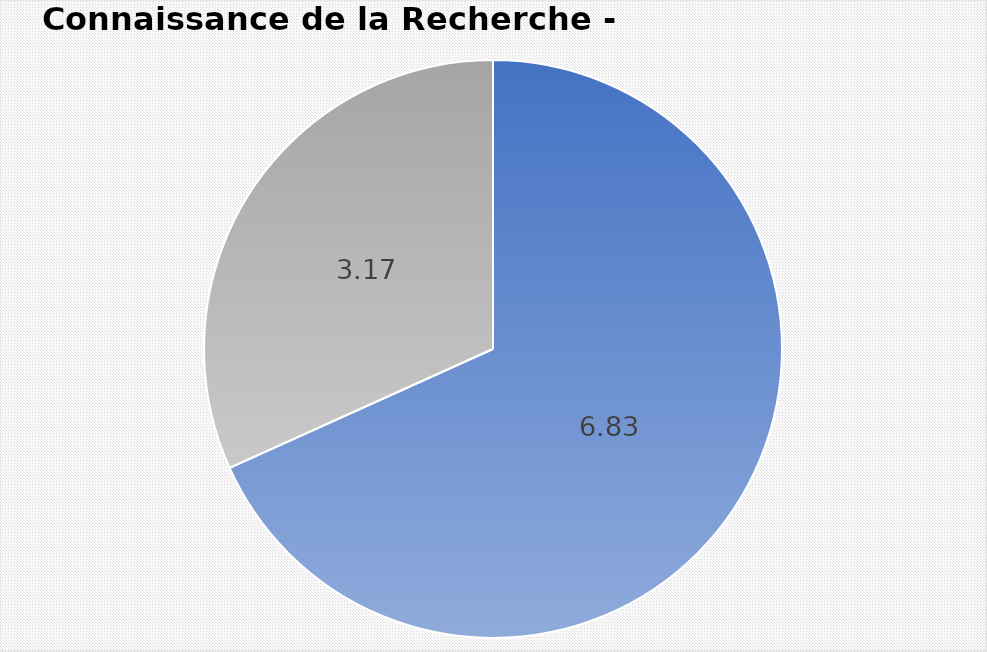
| Category | Series 0 |
|---|---|
| 0 | 6.825 |
| 1 | 3.175 |